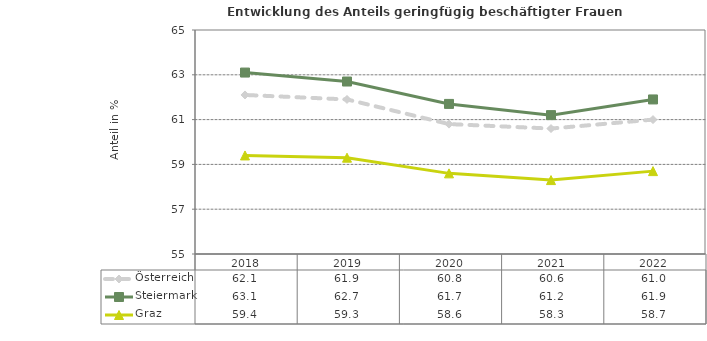
| Category | Österreich | Steiermark | Graz |
|---|---|---|---|
| 2022.0 | 61 | 61.9 | 58.7 |
| 2021.0 | 60.6 | 61.2 | 58.3 |
| 2020.0 | 60.8 | 61.7 | 58.6 |
| 2019.0 | 61.9 | 62.7 | 59.3 |
| 2018.0 | 62.1 | 63.1 | 59.4 |